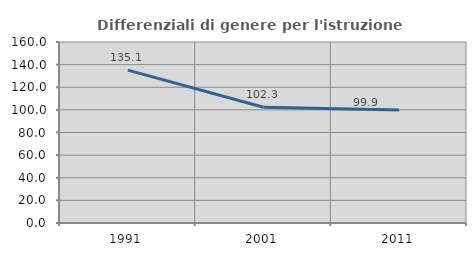
| Category | Differenziali di genere per l'istruzione superiore |
|---|---|
| 1991.0 | 135.142 |
| 2001.0 | 102.328 |
| 2011.0 | 99.912 |